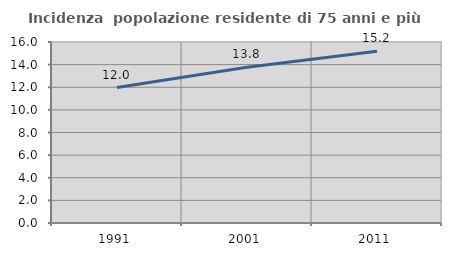
| Category | Incidenza  popolazione residente di 75 anni e più |
|---|---|
| 1991.0 | 11.974 |
| 2001.0 | 13.766 |
| 2011.0 | 15.18 |